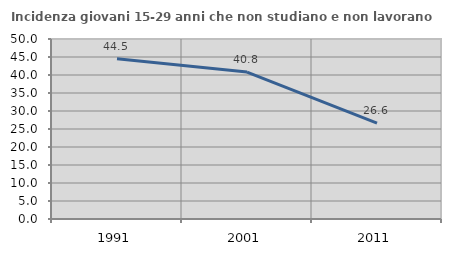
| Category | Incidenza giovani 15-29 anni che non studiano e non lavorano  |
|---|---|
| 1991.0 | 44.516 |
| 2001.0 | 40.805 |
| 2011.0 | 26.619 |